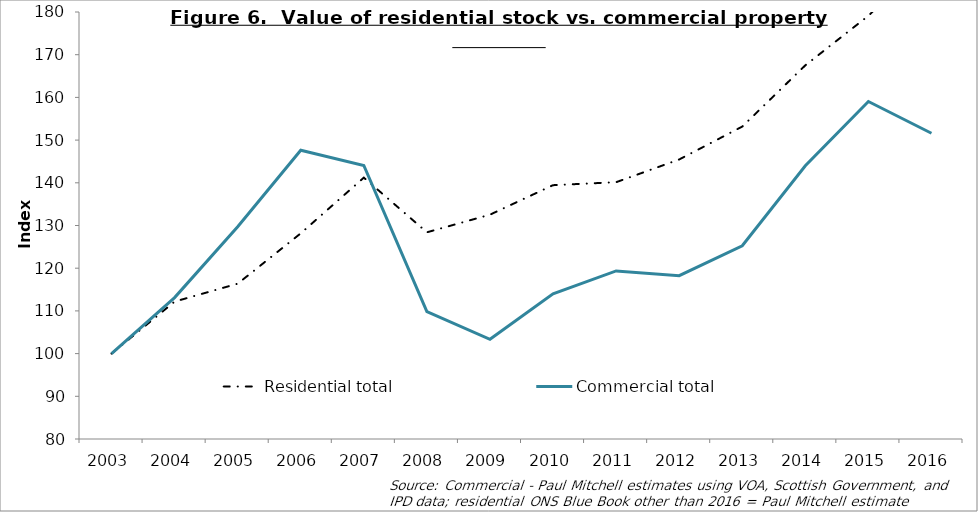
| Category | Residential total | Commercial total |
|---|---|---|
| 2003.0 | 100 | 100 |
| 2004.0 | 112.181 | 113.117 |
| 2005.0 | 116.373 | 129.704 |
| 2006.0 | 128.167 | 147.612 |
| 2007.0 | 141.206 | 144.056 |
| 2008.0 | 128.405 | 109.847 |
| 2009.0 | 132.535 | 103.353 |
| 2010.0 | 139.443 | 114.003 |
| 2011.0 | 140.139 | 119.362 |
| 2012.0 | 145.459 | 118.254 |
| 2013.0 | 153.164 | 125.261 |
| 2014.0 | 167.511 | 143.976 |
| 2015.0 | 179.116 | 159.035 |
| 2016.0 | 193.481 | 151.612 |